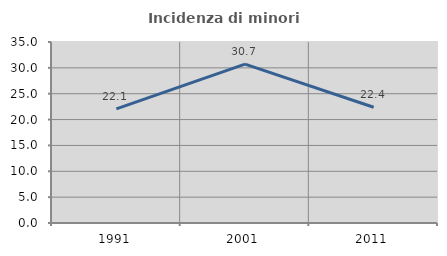
| Category | Incidenza di minori stranieri |
|---|---|
| 1991.0 | 22.059 |
| 2001.0 | 30.719 |
| 2011.0 | 22.387 |